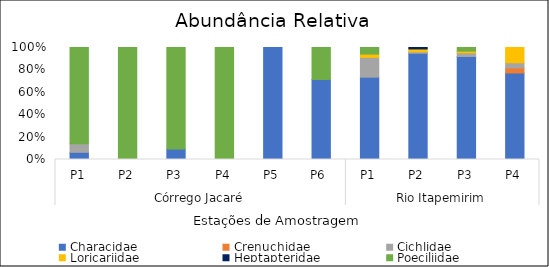
| Category | Characidae | Crenuchidae  | Cichlidae | Loricariidae | Heptapteridae | Poeciliidae |
|---|---|---|---|---|---|---|
| 0 | 6.41 | 0 | 7.692 | 0 | 0 | 85.897 |
| 1 | 0 | 0 | 0 | 0 | 0 | 100 |
| 2 | 9.434 | 0 | 0 | 0 | 0 | 90.566 |
| 3 | 0 | 0 | 0 | 0 | 0 | 100 |
| 4 | 100 | 0 | 0 | 0 | 0 | 0 |
| 5 | 71.429 | 0 | 0 | 0 | 0 | 28.571 |
| 6 | 73.529 | 0 | 17.647 | 2.941 | 0 | 5.882 |
| 7 | 94.872 | 0 | 1.282 | 2.564 | 1.282 | 0 |
| 8 | 92 | 0 | 3.2 | 1.6 | 0 | 3.2 |
| 9 | 77.273 | 4.545 | 4.545 | 13.636 | 0 | 0 |